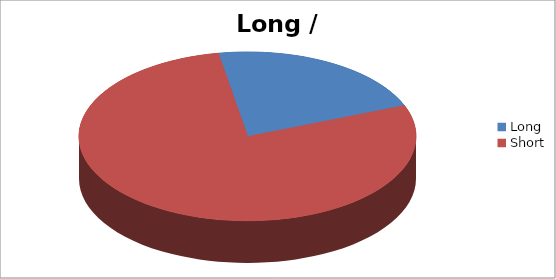
| Category | Series 1 |
|---|---|
| Long | 107 |
| Short | 384 |